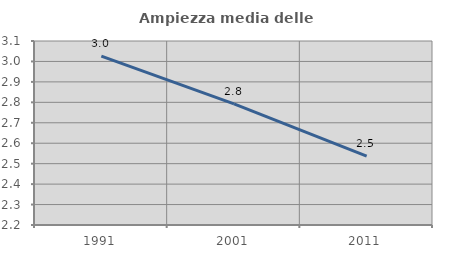
| Category | Ampiezza media delle famiglie |
|---|---|
| 1991.0 | 3.026 |
| 2001.0 | 2.793 |
| 2011.0 | 2.537 |